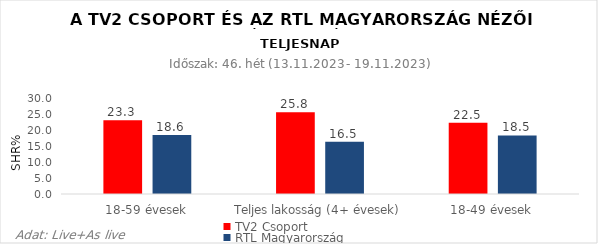
| Category | TV2 Csoport | RTL Magyarország |
|---|---|---|
| 18-59 évesek | 23.3 | 18.6 |
| Teljes lakosság (4+ évesek) | 25.8 | 16.5 |
| 18-49 évesek | 22.5 | 18.5 |